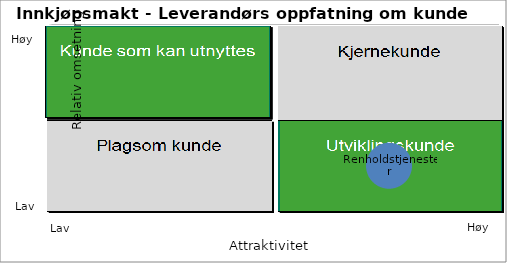
| Category | Renholdstjenester |
|---|---|
| 4.0 | 2 |